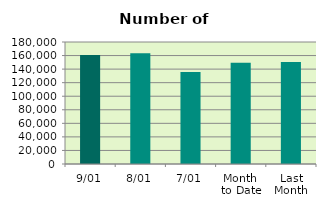
| Category | Series 0 |
|---|---|
| 9/01 | 160994 |
| 8/01 | 163220 |
| 7/01 | 135556 |
| Month 
to Date | 149452.667 |
| Last
Month | 150628.737 |